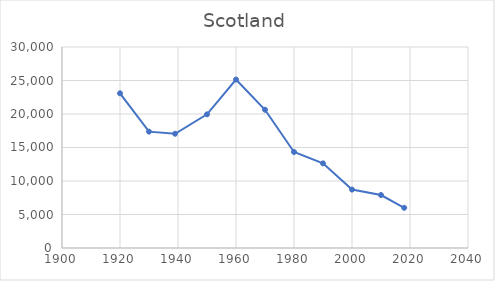
| Category | Scotland |
|---|---|
| 1920.0 | 23093 |
| 1930.0 | 17366 |
| 1939.0 | 17053 |
| 1950.0 | 19948 |
| 1960.0 | 25148 |
| 1970.0 | 20633 |
| 1980.0 | 14334 |
| 1990.0 | 12632 |
| 2000.0 | 8717 |
| 2010.0 | 7905 |
| 2018.0 | 5996 |